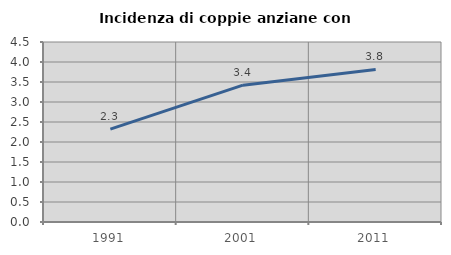
| Category | Incidenza di coppie anziane con figli |
|---|---|
| 1991.0 | 2.324 |
| 2001.0 | 3.421 |
| 2011.0 | 3.815 |